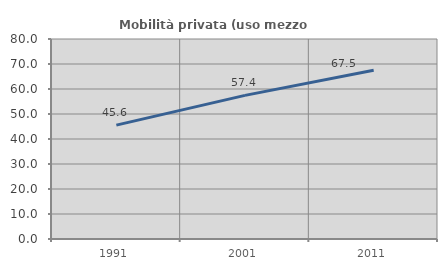
| Category | Mobilità privata (uso mezzo privato) |
|---|---|
| 1991.0 | 45.555 |
| 2001.0 | 57.443 |
| 2011.0 | 67.526 |